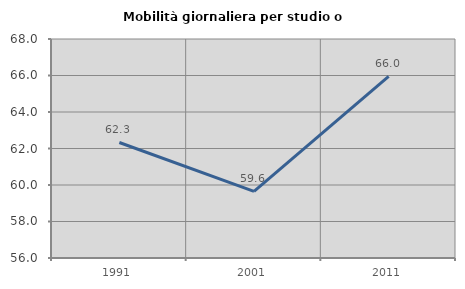
| Category | Mobilità giornaliera per studio o lavoro |
|---|---|
| 1991.0 | 62.329 |
| 2001.0 | 59.647 |
| 2011.0 | 65.951 |